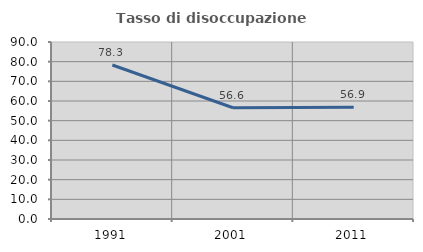
| Category | Tasso di disoccupazione giovanile  |
|---|---|
| 1991.0 | 78.311 |
| 2001.0 | 56.566 |
| 2011.0 | 56.863 |